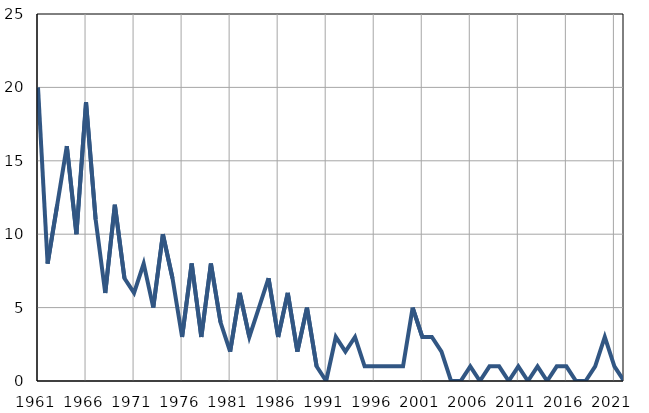
| Category | Infants
deaths |
|---|---|
| 1961.0 | 20 |
| 1962.0 | 8 |
| 1963.0 | 12 |
| 1964.0 | 16 |
| 1965.0 | 10 |
| 1966.0 | 19 |
| 1967.0 | 11 |
| 1968.0 | 6 |
| 1969.0 | 12 |
| 1970.0 | 7 |
| 1971.0 | 6 |
| 1972.0 | 8 |
| 1973.0 | 5 |
| 1974.0 | 10 |
| 1975.0 | 7 |
| 1976.0 | 3 |
| 1977.0 | 8 |
| 1978.0 | 3 |
| 1979.0 | 8 |
| 1980.0 | 4 |
| 1981.0 | 2 |
| 1982.0 | 6 |
| 1983.0 | 3 |
| 1984.0 | 5 |
| 1985.0 | 7 |
| 1986.0 | 3 |
| 1987.0 | 6 |
| 1988.0 | 2 |
| 1989.0 | 5 |
| 1990.0 | 1 |
| 1991.0 | 0 |
| 1992.0 | 3 |
| 1993.0 | 2 |
| 1994.0 | 3 |
| 1995.0 | 1 |
| 1996.0 | 1 |
| 1997.0 | 1 |
| 1998.0 | 1 |
| 1999.0 | 1 |
| 2000.0 | 5 |
| 2001.0 | 3 |
| 2002.0 | 3 |
| 2003.0 | 2 |
| 2004.0 | 0 |
| 2005.0 | 0 |
| 2006.0 | 1 |
| 2007.0 | 0 |
| 2008.0 | 1 |
| 2009.0 | 1 |
| 2010.0 | 0 |
| 2011.0 | 1 |
| 2012.0 | 0 |
| 2013.0 | 1 |
| 2014.0 | 0 |
| 2015.0 | 1 |
| 2016.0 | 1 |
| 2017.0 | 0 |
| 2018.0 | 0 |
| 2019.0 | 1 |
| 2020.0 | 3 |
| 2021.0 | 1 |
| 2022.0 | 0 |